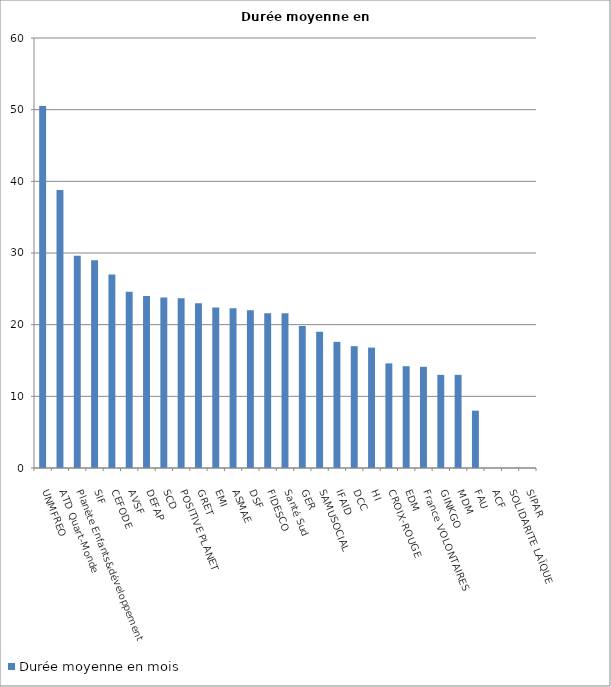
| Category | Durée moyenne en mois |
|---|---|
| UNMFREO  | 50.5 |
| ATD Quart-Monde | 38.8 |
| Planète Enfants&développement | 29.6 |
| SIF | 29 |
| CEFODE | 27 |
| AVSF | 24.6 |
| DEFAP | 24 |
| SCD | 23.8 |
| POSITIVE PLANET | 23.7 |
| GRET | 23 |
| EMI | 22.4 |
| ASMAE | 22.3 |
| DSF | 22 |
| FIDESCO | 21.6 |
| Santé Sud | 21.6 |
| GER | 19.8 |
| SAMUSOCIAL | 19 |
| IFAID | 17.6 |
| DCC | 17 |
| HI | 16.8 |
| CROIX-ROUGE | 14.6 |
| EDM | 14.2 |
| France VOLONTAIRES | 14.12 |
| GINKGO | 13 |
| MDM | 13 |
| FAU | 8 |
| ACF | 0 |
| SOLIDARITE LAÏQUE | 0 |
| SIPAR | 0 |